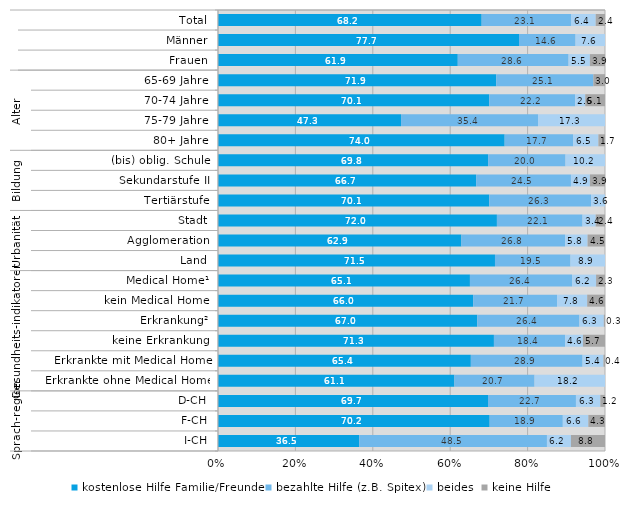
| Category | kostenlose Hilfe Familie/Freunde | bezahlte Hilfe (z.B. Spitex) | beides | keine Hilfe |
|---|---|---|---|---|
| 0 | 68.2 | 23.1 | 6.4 | 2.4 |
| 1 | 77.7 | 14.6 | 7.6 | 0 |
| 2 | 61.9 | 28.6 | 5.5 | 3.9 |
| 3 | 71.9 | 25.1 | 0 | 3 |
| 4 | 70.1 | 22.2 | 2.6 | 5.1 |
| 5 | 47.3 | 35.4 | 17.3 | 0 |
| 6 | 74 | 17.7 | 6.5 | 1.7 |
| 7 | 69.8 | 20 | 10.2 | 0 |
| 8 | 66.7 | 24.5 | 4.9 | 3.9 |
| 9 | 70.1 | 26.3 | 3.6 | 0 |
| 10 | 72 | 22.1 | 3.4 | 2.4 |
| 11 | 62.9 | 26.8 | 5.8 | 4.5 |
| 12 | 71.5 | 19.5 | 8.9 | 0 |
| 13 | 65.1 | 26.4 | 6.2 | 2.3 |
| 14 | 66 | 21.7 | 7.8 | 4.6 |
| 15 | 67 | 26.4 | 6.3 | 0.3 |
| 16 | 71.3 | 18.4 | 4.6 | 5.7 |
| 17 | 65.4 | 28.9 | 5.4 | 0.4 |
| 18 | 61.1 | 20.7 | 18.2 | 0 |
| 19 | 69.7 | 22.7 | 6.3 | 1.2 |
| 20 | 70.2 | 18.9 | 6.6 | 4.3 |
| 21 | 36.5 | 48.5 | 6.2 | 8.8 |